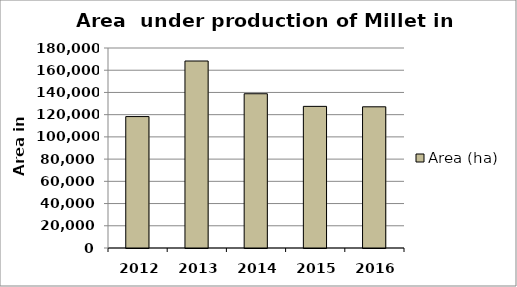
| Category | Area (ha) |
|---|---|
| 2012.0 | 118289 |
| 2013.0 | 168291 |
| 2014.0 | 138829 |
| 2015.0 | 127470 |
| 2016.0 | 127071 |